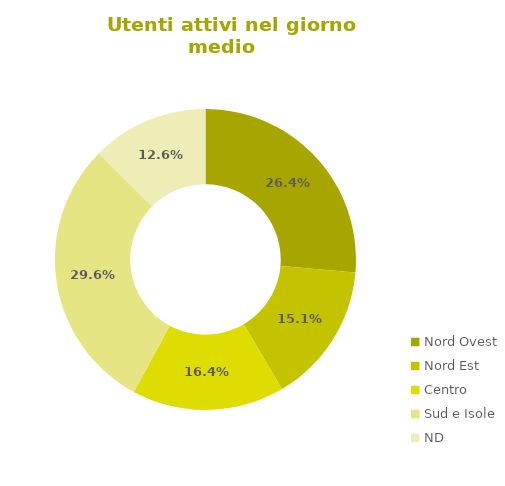
| Category | Series 0 |
|---|---|
| Nord Ovest | 0.264 |
| Nord Est | 0.151 |
| Centro | 0.164 |
| Sud e Isole | 0.296 |
| ND | 0.126 |